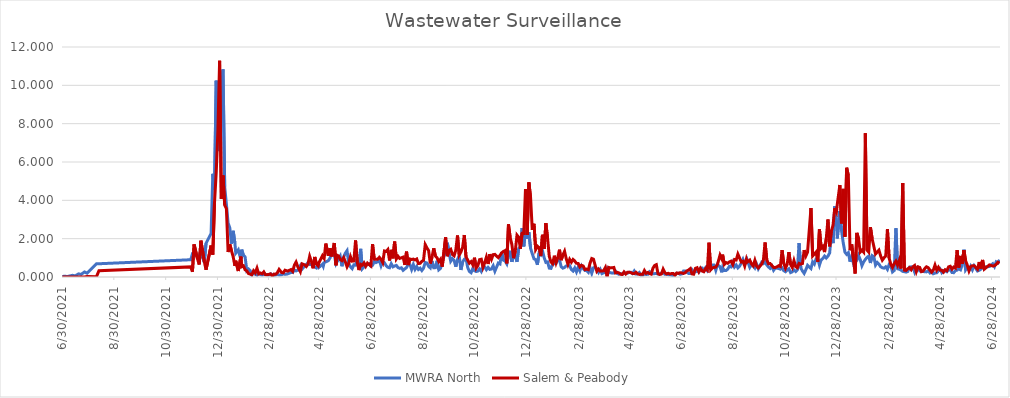
| Category | MWRA North | Salem & Peabody |
|---|---|---|
| 6/30/21 | 0.023 | 0 |
| 7/2/21 | 0.04 | 0 |
| 7/6/21 | 0.027 | 0 |
| 7/8/21 | 0.05 | 0 |
| 7/12/21 | 0.087 | 0 |
| 7/15/21 | 0.059 | 0 |
| 7/19/21 | 0.163 | 0 |
| 7/22/21 | 0.136 | 0 |
| 7/26/21 | 0.263 | 0 |
| 7/29/21 | 0.2 | 0.032 |
| 8/9/21 | 0.691 | 0.007 |
| 8/12/21 | 0.691 | 0.329 |
| 11/28/21 | 0.901 | 0.528 |
| 11/30/21 | 1.204 | 0.275 |
| 12/2/21 | 1.163 | 1.699 |
| 12/6/21 | 1.093 | 0.943 |
| 12/8/21 | 1.152 | 0.651 |
| 12/10/21 | 1.257 | 1.895 |
| 12/14/21 | 0.765 | 0.806 |
| 12/16/21 | 1.751 | 0.377 |
| 12/22/21 | 2.277 | 1.638 |
| 12/24/21 | 5.383 | 1.167 |
| 12/26/21 | 4.572 | 3.882 |
| 12/28/21 | 10.243 | 5.443 |
| 12/30/21 | 8.435 | 7.638 |
| 1/1/22 | 6.568 | 11.282 |
| 1/3/22 | 10.196 | 4.086 |
| 1/5/22 | 10.833 | 5.297 |
| 1/7/22 | 4.705 | 3.753 |
| 1/9/22 | 3.807 | 3.57 |
| 1/11/22 | 2.813 | 1.302 |
| 1/13/22 | 2.562 | 1.704 |
| 1/15/22 | 1.737 | 1.36 |
| 1/17/22 | 2.411 | 1.052 |
| 1/19/22 | 1.766 | 0.581 |
| 1/20/22 | 1.245 | 0.849 |
| 1/23/22 | 1.42 | 0.312 |
| 1/26/22 | 0.904 | 1.062 |
| 1/27/22 | 1.426 | 0.538 |
| 1/29/22 | 1.132 | 0.587 |
| 1/31/22 | 1.053 | 0.378 |
| 2/2/22 | 0.334 | 0.319 |
| 2/4/22 | 0.422 | 0.179 |
| 2/6/22 | 0.336 | 0.151 |
| 2/8/22 | 0.11 | 0.116 |
| 2/10/22 | 0.233 | 0.327 |
| 2/12/22 | 0.14 | 0.223 |
| 2/14/22 | 0.094 | 0.461 |
| 2/16/22 | 0.206 | 0.164 |
| 2/18/22 | 0.124 | 0.209 |
| 2/20/22 | 0.101 | 0.169 |
| 2/22/22 | 0.124 | 0.267 |
| 2/24/22 | 0.138 | 0.116 |
| 2/26/22 | 0.113 | 0.121 |
| 2/28/22 | 0.102 | 0.138 |
| 3/2/22 | 0.17 | 0.16 |
| 3/4/22 | 0.121 | 0.039 |
| 3/6/22 | 0.08 | 0.151 |
| 3/8/22 | 0.105 | 0.146 |
| 3/10/22 | 0.139 | 0.227 |
| 3/12/22 | 0.105 | 0.397 |
| 3/15/22 | 0.115 | 0.231 |
| 3/17/22 | 0.165 | 0.219 |
| 3/19/22 | 0.138 | 0.356 |
| 3/22/22 | 0.161 | 0.308 |
| 3/26/22 | 0.236 | 0.388 |
| 3/28/22 | 0.23 | 0.293 |
| 3/30/22 | 0.371 | 0.617 |
| 4/1/22 | 0.316 | 0.779 |
| 4/3/22 | 0.358 | 0.54 |
| 4/6/22 | 0.589 | 0.279 |
| 4/8/22 | 0.411 | 0.688 |
| 4/11/22 | 0.565 | 0.635 |
| 4/13/22 | 0.647 | 0.546 |
| 4/15/22 | 0.752 | 0.666 |
| 4/17/22 | 0.654 | 1.077 |
| 4/19/22 | 0.641 | 0.82 |
| 4/21/22 | 0.571 | 0.454 |
| 4/23/22 | 0.524 | 1.046 |
| 4/25/22 | 0.471 | 0.662 |
| 4/27/22 | 0.623 | 0.575 |
| 4/28/22 | 0.505 | 0.756 |
| 5/2/22 | 0.662 | 1.104 |
| 5/3/22 | 0.561 | 1.022 |
| 5/4/22 | 0.751 | 0.963 |
| 5/6/22 | 0.789 | 1.744 |
| 5/9/22 | 0.853 | 1.115 |
| 5/11/22 | 0.995 | 1.498 |
| 5/13/22 | 1.285 | 1.074 |
| 5/16/22 | 1.143 | 1.773 |
| 5/18/22 | 0.696 | 0.611 |
| 5/19/22 | 0.784 | 1.144 |
| 5/21/22 | 0.906 | 1.1 |
| 5/23/22 | 1.077 | 0.91 |
| 5/25/22 | 0.561 | 0.853 |
| 5/27/22 | 1.043 | 1.006 |
| 5/29/22 | 1.246 | 0.785 |
| 5/31/22 | 1.375 | 0.53 |
| 6/2/22 | 0.696 | 0.713 |
| 6/4/22 | 0.532 | 1.066 |
| 6/6/22 | 0.435 | 0.828 |
| 6/8/22 | 0.636 | 0.839 |
| 6/10/22 | 0.619 | 1.907 |
| 6/12/22 | 0.932 | 0.783 |
| 6/14/22 | 0.461 | 0.361 |
| 6/16/22 | 1.468 | 0.667 |
| 6/18/22 | 0.433 | 0.622 |
| 6/20/22 | 0.532 | 0.737 |
| 6/22/22 | 0.611 | 0.559 |
| 6/24/22 | 0.648 | 0.724 |
| 6/26/22 | 0.688 | 0.646 |
| 6/28/22 | 0.562 | 0.577 |
| 6/30/22 | 0.607 | 1.712 |
| 7/2/22 | 0.8 | 0.932 |
| 7/4/22 | 0.751 | 0.927 |
| 7/6/22 | 0.8 | 0.928 |
| 7/8/22 | 0.861 | 1.027 |
| 7/10/22 | 0.579 | 0.928 |
| 7/12/22 | 0.808 | 0.757 |
| 7/14/22 | 0.742 | 1.358 |
| 7/16/22 | 0.592 | 1.335 |
| 7/18/22 | 0.509 | 1.432 |
| 7/20/22 | 0.482 | 0.863 |
| 7/22/22 | 0.695 | 1.416 |
| 7/24/22 | 0.53 | 0.974 |
| 7/26/22 | 0.576 | 1.848 |
| 7/28/22 | 0.605 | 0.943 |
| 7/30/22 | 0.492 | 1.081 |
| 8/1/22 | 0.453 | 0.969 |
| 8/3/22 | 0.481 | 1.003 |
| 8/5/22 | 0.349 | 1.038 |
| 8/7/22 | 0.424 | 0.634 |
| 8/9/22 | 0.492 | 1.322 |
| 8/11/22 | 0.664 | 0.624 |
| 8/13/22 | 0.648 | 0.94 |
| 8/15/22 | 0.393 | 0.912 |
| 8/17/22 | 0.648 | 0.935 |
| 8/19/22 | 0.397 | 0.892 |
| 8/21/22 | 0.546 | 0.94 |
| 8/23/22 | 0.392 | 0.701 |
| 8/25/22 | 0.461 | 0.713 |
| 8/27/22 | 0.339 | 0.812 |
| 8/29/22 | 0.46 | 0.873 |
| 8/31/22 | 0.758 | 1.69 |
| 9/2/22 | 0.728 | 1.519 |
| 9/4/22 | 0.557 | 1.377 |
| 9/6/22 | 0.473 | 0.706 |
| 9/8/22 | 0.826 | 1.041 |
| 9/10/22 | 0.485 | 1.497 |
| 9/12/22 | 0.489 | 1.095 |
| 9/14/22 | 0.851 | 0.994 |
| 9/16/22 | 0.375 | 0.804 |
| 9/18/22 | 0.45 | 0.926 |
| 9/20/22 | 0.767 | 0.537 |
| 9/24/22 | 1.357 | 2.067 |
| 9/26/22 | 1.79 | 1.083 |
| 9/28/22 | 1.272 | 1.382 |
| 9/30/22 | 0.825 | 1.447 |
| 10/2/22 | 0.959 | 1.18 |
| 10/4/22 | 0.862 | 1.109 |
| 10/6/22 | 0.536 | 1.407 |
| 10/8/22 | 0.925 | 2.166 |
| 10/10/22 | 1.104 | 1.147 |
| 10/12/22 | 0.369 | 1.304 |
| 10/14/22 | 0.781 | 1.544 |
| 10/16/22 | 0.928 | 2.189 |
| 10/18/22 | 0.972 | 1.054 |
| 10/20/22 | 0.493 | 0.883 |
| 10/22/22 | 0.287 | 0.721 |
| 10/24/22 | 0.224 | 0.803 |
| 10/26/22 | 0.45 | 0.639 |
| 10/28/22 | 0.325 | 1.007 |
| 10/30/22 | 0.287 | 0.464 |
| 11/1/22 | 0.307 | 0.6 |
| 11/3/22 | 0.421 | 0.904 |
| 11/5/22 | 0.293 | 0.926 |
| 11/7/22 | 0.54 | 0.505 |
| 11/9/22 | 0.525 | 0.742 |
| 11/11/22 | 0.38 | 1.039 |
| 11/13/22 | 0.5 | 0.678 |
| 11/15/22 | 0.397 | 1.19 |
| 11/17/22 | 0.414 | 0.927 |
| 11/19/22 | 0.583 | 1.166 |
| 11/21/22 | 0.304 | 1.181 |
| 11/25/22 | 0.727 | 1.009 |
| 11/27/22 | 0.682 | 1.128 |
| 11/29/22 | 1.292 | 1.263 |
| 12/1/22 | 0.879 | 1.332 |
| 12/3/22 | 0.834 | 1.378 |
| 12/5/22 | 0.685 | 0.71 |
| 12/7/22 | 1.094 | 2.747 |
| 12/9/22 | 1.37 | 2.05 |
| 12/11/22 | 0.792 | 1.692 |
| 12/13/22 | 1.108 | 0.983 |
| 12/15/22 | 1.123 | 1.348 |
| 12/17/22 | 0.789 | 2.185 |
| 12/19/22 | 1.476 | 2.073 |
| 12/21/22 | 1.593 | 1.47 |
| 12/23/22 | 2.551 | 2.278 |
| 12/25/22 | 1.597 | 2.275 |
| 12/27/22 | 2.423 | 4.578 |
| 12/29/22 | 2.003 | 2.196 |
| 12/31/22 | 2.33 | 4.939 |
| 1/2/23 | 1.499 | 4.153 |
| 1/4/23 | 1.214 | 2.457 |
| 1/6/23 | 0.947 | 2.778 |
| 1/8/23 | 0.904 | 1.437 |
| 1/10/23 | 0.64 | 1.61 |
| 1/12/23 | 1.241 | 1.532 |
| 1/14/23 | 1.154 | 1.092 |
| 1/16/23 | 1.37 | 2.202 |
| 1/18/23 | 1.009 | 1.465 |
| 1/20/23 | 0.763 | 2.809 |
| 1/22/23 | 0.787 | 2.022 |
| 1/24/23 | 0.465 | 1.08 |
| 1/26/23 | 0.448 | 0.782 |
| 1/28/23 | 0.685 | 0.698 |
| 1/30/23 | 0.689 | 1.11 |
| 2/1/23 | 0.706 | 0.743 |
| 2/3/23 | 0.907 | 1.008 |
| 2/5/23 | 0.913 | 1.425 |
| 2/7/23 | 0.539 | 0.879 |
| 2/9/23 | 0.461 | 1.141 |
| 2/11/23 | 0.498 | 1.339 |
| 2/13/23 | 0.579 | 0.95 |
| 2/15/23 | 0.588 | 0.66 |
| 2/17/23 | 0.592 | 0.919 |
| 2/19/23 | 0.391 | 0.773 |
| 2/21/23 | 0.312 | 0.917 |
| 2/23/23 | 0.472 | 0.828 |
| 2/25/23 | 0.266 | 0.714 |
| 2/27/23 | 0.513 | 0.704 |
| 3/1/23 | 0.321 | 0.528 |
| 3/3/23 | 0.58 | 0.61 |
| 3/5/23 | 0.437 | 0.573 |
| 3/7/23 | 0.341 | 0.388 |
| 3/9/23 | 0.33 | 0.412 |
| 3/11/23 | 0.24 | 0.383 |
| 3/13/23 | 0.499 | 0.725 |
| 3/15/23 | 0.197 | 0.964 |
| 3/17/23 | 0.479 | 0.931 |
| 3/19/23 | 0.51 | 0.612 |
| 3/21/23 | 0.399 | 0.301 |
| 3/23/23 | 0.237 | 0.415 |
| 3/25/23 | 0.395 | 0.308 |
| 3/27/23 | 0.178 | 0.314 |
| 3/29/23 | 0.217 | 0.326 |
| 3/31/23 | 0.243 | 0.491 |
| 4/2/23 | 0.43 | 0.024 |
| 4/4/23 | 0.215 | 0.5 |
| 4/6/23 | 0.229 | 0.475 |
| 4/8/23 | 0.202 | 0.481 |
| 4/10/23 | 0.209 | 0.497 |
| 4/12/23 | 0.305 | 0.215 |
| 4/14/23 | 0.182 | 0.243 |
| 4/16/23 | 0.142 | 0.21 |
| 4/18/23 | 0.177 | 0.143 |
| 4/20/23 | 0.158 | 0.13 |
| 4/22/23 | 0.195 | 0.266 |
| 4/24/23 | 0.209 | 0.158 |
| 4/26/23 | 0.195 | 0.249 |
| 4/28/23 | 0.245 | 0.25 |
| 4/30/23 | 0.245 | 0.228 |
| 5/2/23 | 0.18 | 0.185 |
| 5/4/23 | 0.314 | 0.177 |
| 5/6/23 | 0.157 | 0.247 |
| 5/8/23 | 0.162 | 0.165 |
| 5/10/23 | 0.234 | 0.135 |
| 5/12/23 | 0.1 | 0.143 |
| 5/14/23 | 0.1 | 0.144 |
| 5/16/23 | 0.156 | 0.338 |
| 5/18/23 | 0.134 | 0.195 |
| 5/20/23 | 0.141 | 0.237 |
| 5/22/23 | 0.279 | 0.178 |
| 5/24/23 | 0.223 | 0.15 |
| 5/26/23 | 0.176 | 0.458 |
| 5/28/23 | 0.176 | 0.602 |
| 5/30/23 | 0.183 | 0.643 |
| 6/1/23 | 0.153 | 0.167 |
| 6/3/23 | 0.172 | 0.13 |
| 6/5/23 | 0.198 | 0.156 |
| 6/7/23 | 0.243 | 0.409 |
| 6/9/23 | 0.143 | 0.231 |
| 6/11/23 | 0.143 | 0.16 |
| 6/13/23 | 0.122 | 0.195 |
| 6/15/23 | 0.11 | 0.156 |
| 6/17/23 | 0.095 | 0.181 |
| 6/19/23 | 0.054 | 0.18 |
| 6/21/23 | 0.122 | 0.089 |
| 6/23/23 | 0.195 | 0.208 |
| 6/25/23 | 0.195 | 0.187 |
| 6/27/23 | 0.141 | 0.225 |
| 6/29/23 | 0.16 | 0.211 |
| 7/1/23 | 0.31 | 0.183 |
| 7/3/23 | 0.312 | 0.225 |
| 7/5/23 | 0.244 | 0.321 |
| 7/7/23 | 0.184 | 0.366 |
| 7/9/23 | 0.184 | 0.437 |
| 7/11/23 | 0.38 | 0.163 |
| 7/13/23 | 0.255 | 0.147 |
| 7/15/23 | 0.268 | 0.451 |
| 7/17/23 | 0.315 | 0.484 |
| 7/19/23 | 0.252 | 0.278 |
| 7/21/23 | 0.47 | 0.451 |
| 7/23/23 | 0.47 | 0.309 |
| 7/25/23 | 0.325 | 0.277 |
| 7/27/23 | 0.478 | 0.439 |
| 7/29/23 | 0.339 | 0.359 |
| 7/31/23 | 0.538 | 1.791 |
| 8/2/23 | 0.514 | 0.375 |
| 8/4/23 | 0.625 | 0.476 |
| 8/6/23 | 0.625 | 0.501 |
| 8/8/23 | 0.347 | 0.517 |
| 8/10/23 | 0.645 | 0.663 |
| 8/13/23 | 0.533 | 1.145 |
| 8/15/23 | 0.245 | 0.951 |
| 8/16/23 | 0.489 | 1.169 |
| 8/18/23 | 0.336 | 0.656 |
| 8/20/23 | 0.336 | 0.753 |
| 8/22/23 | 0.407 | 0.717 |
| 8/24/23 | 0.558 | 0.79 |
| 8/26/23 | 0.526 | 0.826 |
| 8/28/23 | 0.757 | 0.651 |
| 8/30/23 | 0.52 | 0.914 |
| 9/1/23 | 0.628 | 0.889 |
| 9/3/23 | 0.475 | 1.194 |
| 9/5/23 | 0.563 | 0.989 |
| 9/7/23 | 0.731 | 0.782 |
| 9/9/23 | 0.922 | 0.819 |
| 9/11/23 | 0.696 | 0.573 |
| 9/13/23 | 0.75 | 0.928 |
| 9/14/23 | 0.882 | 0.78 |
| 9/17/23 | 0.503 | 0.884 |
| 9/19/23 | 0.645 | 0.68 |
| 9/21/23 | 0.575 | 0.58 |
| 9/23/23 | 0.465 | 0.87 |
| 9/25/23 | 0.673 | 0.57 |
| 9/27/23 | 0.429 | 0.47 |
| 10/1/23 | 0.773 | 0.67 |
| 10/3/23 | 0.702 | 0.88 |
| 10/5/23 | 0.78 | 1.8 |
| 10/7/23 | 0.63 | 0.9 |
| 10/9/23 | 0.524 | 0.69 |
| 10/11/23 | 0.448 | 0.7 |
| 10/13/23 | 0.571 | 0.6 |
| 10/15/23 | 0.35 | 0.5 |
| 10/17/23 | 0.468 | 0.5 |
| 10/19/23 | 0.46 | 0.53 |
| 10/21/23 | 0.442 | 0.59 |
| 10/23/23 | 0.407 | 0.55 |
| 10/25/23 | 0.475 | 1.4 |
| 10/27/23 | 0.329 | 0.7 |
| 10/29/23 | 0.277 | 0.46 |
| 10/31/23 | 0.366 | 0.66 |
| 11/2/23 | 0.431 | 1.3 |
| 11/4/23 | 0.23 | 0.66 |
| 11/6/23 | 0.268 | 0.5 |
| 11/8/23 | 0.372 | 0.85 |
| 11/10/23 | 0.287 | 0.54 |
| 11/12/23 | 0.373 | 0.48 |
| 11/14/23 | 1.767 | 0.71 |
| 11/16/23 | 0.468 | 0.67 |
| 11/18/23 | 0.315 | 0.7 |
| 11/20/23 | 0.188 | 1.4 |
| 11/22/23 | 0.38 | 1.1 |
| 11/24/23 | 0.608 | 1.3 |
| 11/28/23 | 0.44 | 3.6 |
| 11/30/23 | 0.791 | 1.1 |
| 12/2/23 | 0.677 | 1.2 |
| 12/4/23 | 0.943 | 1.3 |
| 12/6/23 | 0.966 | 0.79 |
| 12/8/23 | 0.618 | 2.5 |
| 12/10/23 | 0.892 | 1.5 |
| 12/12/23 | 0.964 | 1.6 |
| 12/14/23 | 1.091 | 1.3 |
| 12/16/23 | 0.99 | 2 |
| 12/18/23 | 1.089 | 3 |
| 12/20/23 | 1.252 | 1.6 |
| 12/22/23 | 2.214 | 2.4 |
| 12/24/23 | 1.769 | 2.7 |
| 12/26/23 | 3.689 | 3.6 |
| 12/28/23 | 2.81 | 3.4 |
| 12/29/23 | 2.013 | 3.8 |
| 1/1/24 | 3.443 | 4.8 |
| 1/3/24 | 2.411 | 2.8 |
| 1/5/24 | 1.78 | 4.6 |
| 1/7/24 | 1.295 | 2.1 |
| 1/9/24 | 1.184 | 5.7 |
| 1/11/24 | 1.27 | 5.3 |
| 1/13/24 | 0.802 | 1.4 |
| 1/15/24 | 1.091 | 1.7 |
| 1/17/24 | 0.716 | 0.94 |
| 1/19/24 | 0.852 | 0.18 |
| 1/21/24 | 0.866 | 2.3 |
| 1/23/24 | 1.127 | 2 |
| 1/25/24 | 0.911 | 1.3 |
| 1/27/24 | 0.591 | 1.4 |
| 1/29/24 | 0.786 | 1.3 |
| 1/31/24 | 0.915 | 7.5 |
| 2/2/24 | 1.022 | 1.4 |
| 2/4/24 | 1.092 | 1.3 |
| 2/6/24 | 0.732 | 2.6 |
| 2/8/24 | 1.114 | 2 |
| 2/10/24 | 1.061 | 1.6 |
| 2/12/24 | 0.622 | 1.2 |
| 2/14/24 | 0.758 | 1.3 |
| 2/16/24 | 0.672 | 1.4 |
| 2/18/24 | 0.536 | 1.1 |
| 2/20/24 | 0.483 | 0.88 |
| 2/22/24 | 0.462 | 1 |
| 2/24/24 | 0.532 | 1.1 |
| 2/26/24 | 0.398 | 2.5 |
| 2/28/24 | 0.647 | 0.99 |
| 3/1/24 | 0.579 | 0.66 |
| 3/3/24 | 0.265 | 0.5 |
| 3/5/24 | 0.341 | 0.7 |
| 3/7/24 | 2.546 | 0.83 |
| 3/9/24 | 0.429 | 0.62 |
| 3/11/24 | 0.407 | 0.87 |
| 3/13/24 | 0.358 | 0.44 |
| 3/15/24 | 0.293 | 4.9 |
| 3/17/24 | 0.275 | 0.36 |
| 3/19/24 | 0.256 | 0.34 |
| 3/21/24 | 0.289 | 0.43 |
| 3/23/24 | 0.517 | 0.49 |
| 3/25/24 | 0.532 | 0.38 |
| 3/27/24 | 0.511 | 0.53 |
| 3/29/24 | 0.256 | 0.6 |
| 3/31/24 | 0.474 | 0.28 |
| 4/2/24 | 0.507 | 0.53 |
| 4/4/24 | 0.315 | 0.5 |
| 4/6/24 | 0.284 | 0.28 |
| 4/8/24 | 0.287 | 0.31 |
| 4/10/24 | 0.272 | 0.44 |
| 4/12/24 | 0.267 | 0.53 |
| 4/14/24 | 0.327 | 0.49 |
| 4/16/24 | 0.217 | 0.36 |
| 4/18/24 | 0.3 | 0.25 |
| 4/20/24 | 0.171 | 0.36 |
| 4/22/24 | 0.212 | 0.62 |
| 4/24/24 | 0.216 | 0.36 |
| 4/26/24 | 0.318 | 0.51 |
| 4/28/24 | 0.415 | 0.36 |
| 4/30/24 | 0.23 | 0.35 |
| 5/2/24 | 0.337 | 0.25 |
| 5/4/24 | 0.323 | 0.38 |
| 5/6/24 | 0.274 | 0.33 |
| 5/8/24 | 0.379 | 0.53 |
| 5/10/24 | 0.373 | 0.56 |
| 5/12/24 | 0.235 | 0.41 |
| 5/14/24 | 0.225 | 0.52 |
| 5/16/24 | 0.332 | 0.47 |
| 5/18/24 | 0.359 | 1.4 |
| 5/20/24 | 0.429 | 0.49 |
| 5/22/24 | 0.374 | 1.1 |
| 5/24/24 | 0.634 | 0.69 |
| 5/26/24 | 1.424 | 1.4 |
| 5/28/24 | 0.373 | 0.85 |
| 5/30/24 | 0.508 | 0.62 |
| 6/1/24 | 0.354 | 0.32 |
| 6/3/24 | 0.559 | 0.54 |
| 6/5/24 | 0.371 | 0.59 |
| 6/7/24 | 0.587 | 0.59 |
| 6/11/24 | 0.312 | 0.41 |
| 6/13/24 | 0.352 | 0.78 |
| 6/15/24 | 0.406 | 0.44 |
| 6/17/24 | 0.51 | 0.89 |
| 6/19/24 | 0.522 | 0.41 |
| 6/25/24 | 0.545 | 0.63 |
| 6/29/24 | 0.693 | 0.57 |
| 7/1/24 | 0.542 | 0.59 |
| 7/3/24 | 0.79 | 0.66 |
| 7/5/24 | 0.734 | 0.77 |
| 7/7/24 | 0.899 | 0.72 |